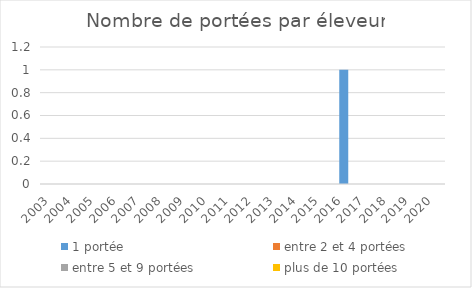
| Category | 1 portée | entre 2 et 4 portées | entre 5 et 9 portées | plus de 10 portées |
|---|---|---|---|---|
| 2003.0 | 0 | 0 | 0 | 0 |
| 2004.0 | 0 | 0 | 0 | 0 |
| 2005.0 | 0 | 0 | 0 | 0 |
| 2006.0 | 0 | 0 | 0 | 0 |
| 2007.0 | 0 | 0 | 0 | 0 |
| 2008.0 | 0 | 0 | 0 | 0 |
| 2009.0 | 0 | 0 | 0 | 0 |
| 2010.0 | 0 | 0 | 0 | 0 |
| 2011.0 | 0 | 0 | 0 | 0 |
| 2012.0 | 0 | 0 | 0 | 0 |
| 2013.0 | 0 | 0 | 0 | 0 |
| 2014.0 | 0 | 0 | 0 | 0 |
| 2015.0 | 0 | 0 | 0 | 0 |
| 2016.0 | 1 | 0 | 0 | 0 |
| 2017.0 | 0 | 0 | 0 | 0 |
| 2018.0 | 0 | 0 | 0 | 0 |
| 2019.0 | 0 | 0 | 0 | 0 |
| 2020.0 | 0 | 0 | 0 | 0 |